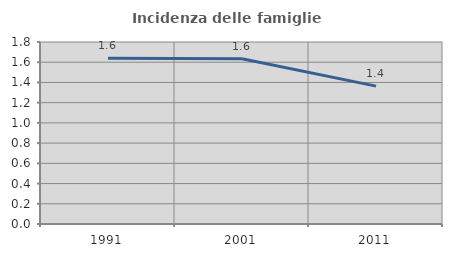
| Category | Incidenza delle famiglie numerose |
|---|---|
| 1991.0 | 1.639 |
| 2001.0 | 1.635 |
| 2011.0 | 1.364 |